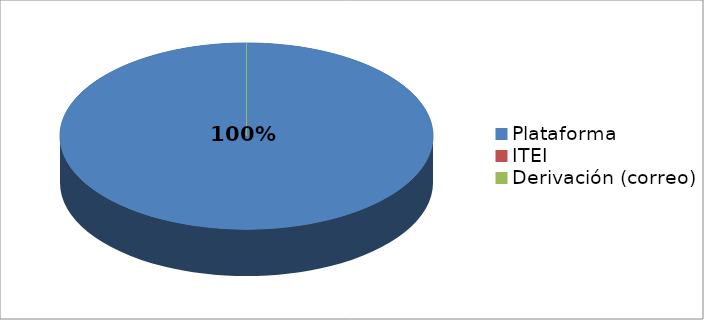
| Category | Series 0 | Series 1 |
|---|---|---|
| Plataforma | 6 | 1 |
| ITEI | 0 | 0 |
| Derivación (correo) | 0 | 0 |